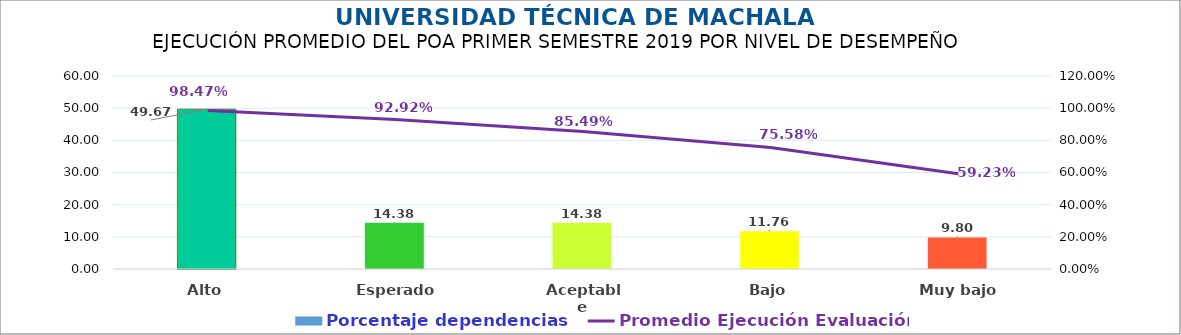
| Category | Porcentaje dependencias |
|---|---|
| Alto | 49.673 |
| Esperado | 14.379 |
| Aceptable | 14.379 |
| Bajo | 11.765 |
| Muy bajo | 9.804 |